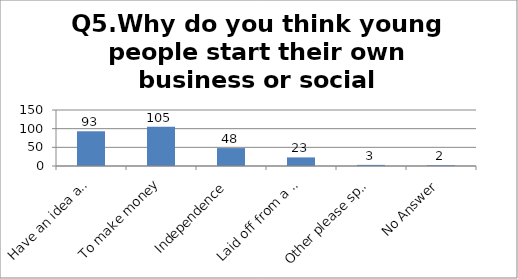
| Category | Q5.Why do you think young people start their own business or social enterprise? |
|---|---|
| Have an idea and want to see it in action | 93 |
| To make money | 105 |
| Independence | 48 |
| Laid off from a company/unemployed | 23 |
| Other please specify | 3 |
| No Answer | 2 |